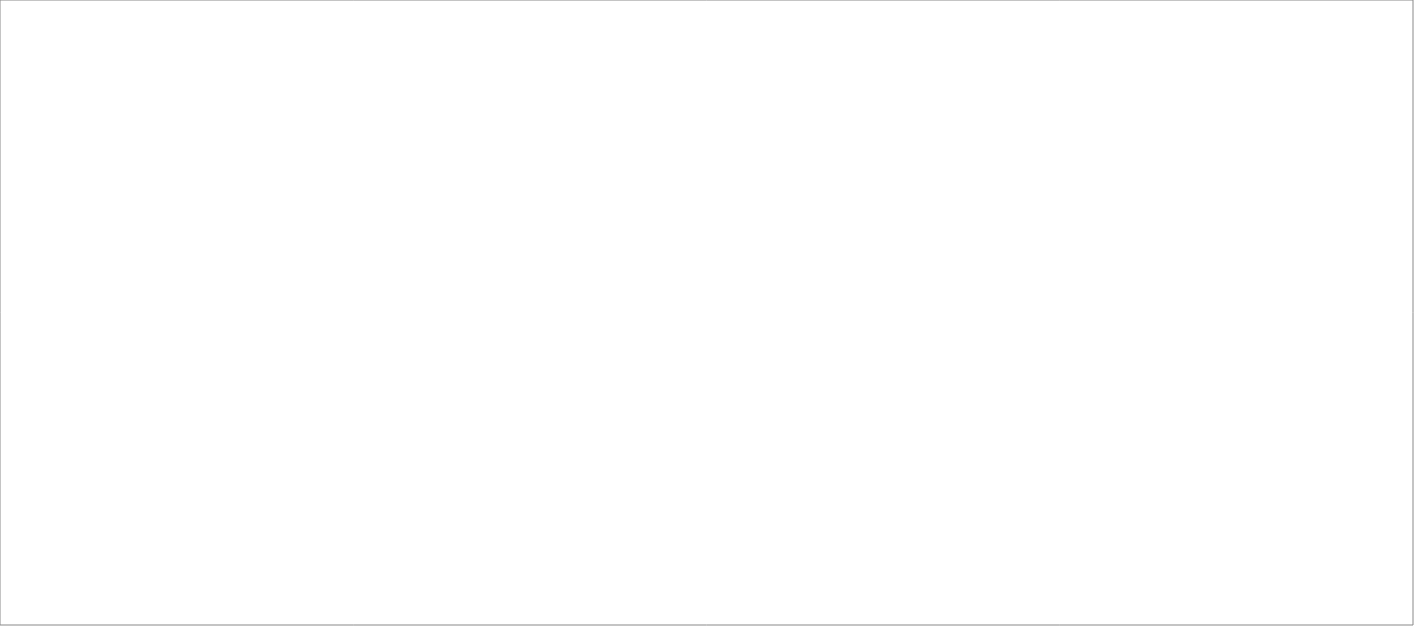
| Category | Total |
|---|---|
| Poolia Sverige AB | 85 |
| Randstad AB | 80 |
| Source Executive Recruitment Sweden AB | 25 |
| Compass Rekrytering & Utveckling AB | 25 |
| Lisberg Sverige AB | 25 |